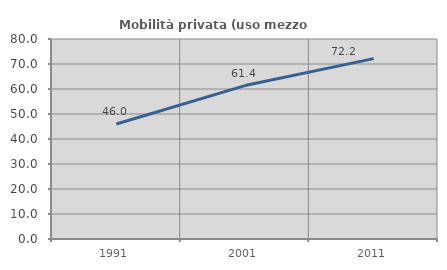
| Category | Mobilità privata (uso mezzo privato) |
|---|---|
| 1991.0 | 46.01 |
| 2001.0 | 61.369 |
| 2011.0 | 72.151 |